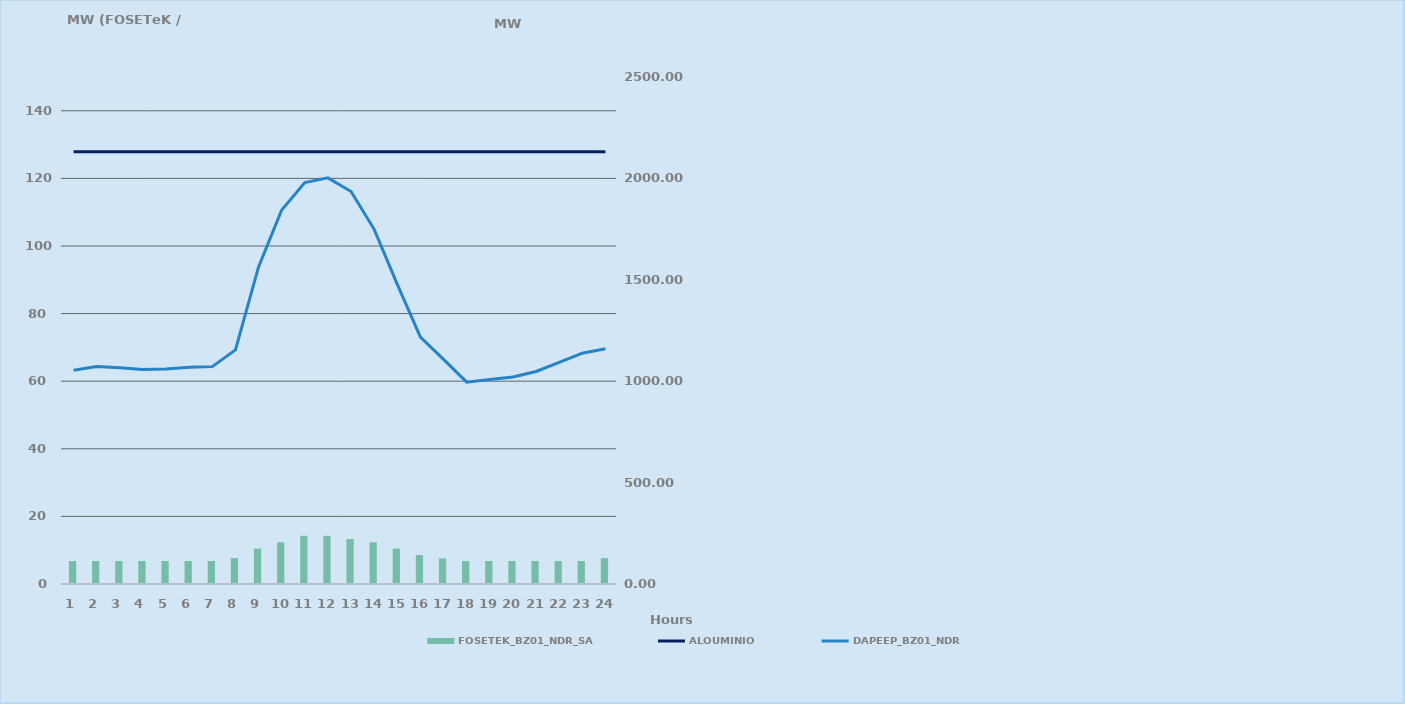
| Category | FOSETEK_BZ01_NDR_SA |
|---|---|
| 0 | 6.8 |
| 1 | 6.8 |
| 2 | 6.8 |
| 3 | 6.8 |
| 4 | 6.8 |
| 5 | 6.8 |
| 6 | 6.8 |
| 7 | 7.65 |
| 8 | 10.45 |
| 9 | 12.35 |
| 10 | 14.25 |
| 11 | 14.25 |
| 12 | 13.3 |
| 13 | 12.35 |
| 14 | 10.45 |
| 15 | 8.55 |
| 16 | 7.6 |
| 17 | 6.8 |
| 18 | 6.8 |
| 19 | 6.8 |
| 20 | 6.8 |
| 21 | 6.8 |
| 22 | 6.8 |
| 23 | 7.65 |